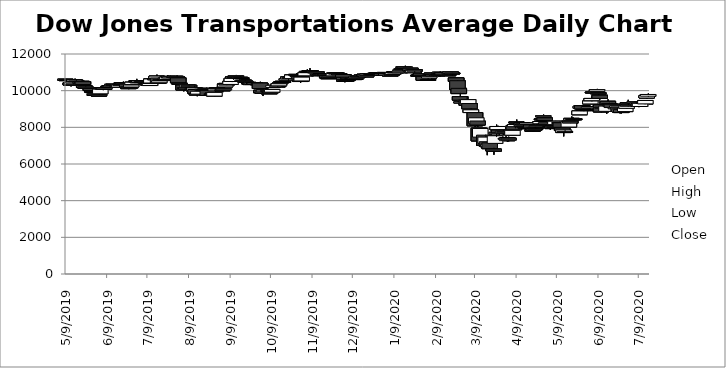
| Category | Open | High | Low | Close |
|---|---|---|---|---|
| 5/9/19 | 10580.43 | 10644.41 | 10483.71 | 10627.37 |
| 5/10/19 | 10601.52 | 10639.49 | 10372.99 | 10602.19 |
| 5/13/19 | 10427.68 | 10433.23 | 10229.95 | 10305.85 |
| 5/14/19 | 10328.77 | 10528.94 | 10328.44 | 10454.97 |
| 5/15/19 | 10405.1 | 10500.78 | 10332.63 | 10475.08 |
| 5/16/19 | 10495.08 | 10657.79 | 10493.3 | 10605.61 |
| 5/17/19 | 10538.49 | 10619.79 | 10469.27 | 10491.85 |
| 5/20/19 | 10427.78 | 10508.19 | 10389.24 | 10461.73 |
| 5/21/19 | 10504.59 | 10563.59 | 10491.45 | 10510.87 |
| 5/22/19 | 10490.14 | 10490.14 | 10307.77 | 10332.98 |
| 5/23/19 | 10278.9 | 10278.9 | 10083.66 | 10171.61 |
| 5/24/19 | 10204.95 | 10242 | 10063.12 | 10137.59 |
| 5/28/19 | 10124.26 | 10164.05 | 10005.24 | 10005.97 |
| 5/29/19 | 9973.82 | 9980.24 | 9880.54 | 9929.95 |
| 5/30/19 | 9944.4 | 10007.8 | 9865.72 | 9926.47 |
| 5/31/19 | 9811.49 | 9819.3 | 9722.26 | 9738.03 |
| 6/3/19 | 9739.37 | 9881.3 | 9715.2 | 9759.86 |
| 6/4/19 | 9828.11 | 10089.3 | 9821.95 | 10083.76 |
| 6/5/19 | 10109.36 | 10190.78 | 10097.05 | 10171.3 |
| 6/6/19 | 10155.27 | 10155.27 | 10013.16 | 10077.54 |
| 6/7/19 | 10103.88 | 10219.19 | 10103.88 | 10140.64 |
| 6/10/19 | 10194.59 | 10358.1 | 10194.59 | 10231.9 |
| 6/11/19 | 10275.18 | 10339.82 | 10150.78 | 10198.55 |
| 6/12/19 | 10198.43 | 10258.33 | 10159.03 | 10246.96 |
| 6/13/19 | 10268.23 | 10365.71 | 10256.13 | 10347.36 |
| 6/14/19 | 10347.91 | 10353.07 | 10218.81 | 10305.3 |
| 6/17/19 | 10297.31 | 10297.31 | 10191.48 | 10199.04 |
| 6/18/19 | 10194.22 | 10386.79 | 10194.22 | 10320.85 |
| 6/19/19 | 10333.89 | 10353.71 | 10269.76 | 10341.63 |
| 6/20/19 | 10431.71 | 10462.59 | 10345.84 | 10412.66 |
| 6/21/19 | 10412.9 | 10492.79 | 10350.93 | 10352.49 |
| 6/24/19 | 10357.48 | 10364.66 | 10189.93 | 10197.39 |
| 6/25/19 | 10193.4 | 10206.77 | 10082.88 | 10109.91 |
| 6/26/19 | 10127.1 | 10209.94 | 10109.39 | 10176.79 |
| 6/27/19 | 10199.1 | 10360.62 | 10195.51 | 10308.53 |
| 6/28/19 | 10332.2 | 10471.85 | 10332.2 | 10461.98 |
| 7/1/19 | 10533.24 | 10643.83 | 10444.65 | 10505.93 |
| 7/2/19 | 10527.15 | 10531.41 | 10386.77 | 10420.46 |
| 7/3/19 | 10443.02 | 10534.46 | 10435.63 | 10523.31 |
| 7/5/19 | 10493.01 | 10510.17 | 10344.74 | 10485.02 |
| 7/8/19 | 10457.4 | 10471.77 | 10378.58 | 10416.13 |
| 7/9/19 | 10385.95 | 10397.2 | 10304.99 | 10339.01 |
| 7/10/19 | 10363.6 | 10432.53 | 10274.14 | 10291.64 |
| 7/11/19 | 10280.37 | 10420.92 | 10260.25 | 10390.04 |
| 7/12/19 | 10417.41 | 10655 | 10416.36 | 10637.31 |
| 7/15/19 | 10635.39 | 10655.44 | 10572.97 | 10601.03 |
| 7/16/19 | 10668.64 | 10876.38 | 10666 | 10794.59 |
| 7/17/19 | 10693.12 | 10693.12 | 10403.09 | 10406.93 |
| 7/18/19 | 10432.01 | 10542.8 | 10432.01 | 10537.51 |
| 7/19/19 | 10554.58 | 10673.67 | 10554.58 | 10604.2 |
| 7/22/19 | 10624.63 | 10691.82 | 10602.88 | 10622.92 |
| 7/23/19 | 10655.66 | 10721.12 | 10636.07 | 10717.6 |
| 7/24/19 | 10611.46 | 10853.3 | 10583.11 | 10775.39 |
| 7/25/19 | 10757.92 | 10780.6 | 10666.22 | 10693.82 |
| 7/26/19 | 10699.67 | 10808.04 | 10668.12 | 10776.67 |
| 7/29/19 | 10756.1 | 10785.91 | 10736.03 | 10776 |
| 7/30/19 | 10739.06 | 10799.72 | 10632.72 | 10784.84 |
| 7/31/19 | 10753.84 | 10819.32 | 10598.57 | 10701.75 |
| 8/1/19 | 10699.13 | 10710.53 | 10399.09 | 10433.45 |
| 8/2/19 | 10410.34 | 10434.16 | 10313.26 | 10374.43 |
| 8/5/19 | 10304.9 | 10304.9 | 9959.84 | 10040.23 |
| 8/6/19 | 10137.53 | 10195.26 | 10038.77 | 10172.52 |
| 8/7/19 | 10110.28 | 10166.36 | 9965.07 | 10150.21 |
| 8/8/19 | 10184.81 | 10339.37 | 10183.45 | 10324.38 |
| 8/9/19 | 10297.68 | 10310.18 | 10161.28 | 10207.21 |
| 8/12/19 | 10165.27 | 10165.27 | 9997.16 | 10032.49 |
| 8/13/19 | 10018.22 | 10271.68 | 9956.45 | 10148.68 |
| 8/14/19 | 10063.58 | 10063.58 | 9820.3 | 9842.4 |
| 8/15/19 | 9858.92 | 9870.57 | 9695.49 | 9764.49 |
| 8/16/19 | 9810.24 | 9988.63 | 9795.39 | 9967.32 |
| 8/19/19 | 10061.02 | 10162.22 | 10061.02 | 10081.38 |
| 8/20/19 | 10054.68 | 10064.89 | 10001.88 | 10006.03 |
| 8/21/19 | 10089.73 | 10145.39 | 10075.46 | 10107.47 |
| 8/22/19 | 10129.48 | 10155.82 | 10019.56 | 10073.15 |
| 8/23/19 | 10020.05 | 10051.43 | 9702.19 | 9739.74 |
| 8/26/19 | 9824.08 | 9864.12 | 9748.97 | 9834.72 |
| 8/27/19 | 9893.73 | 9897.79 | 9717.86 | 9734.68 |
| 8/28/19 | 9703.34 | 9931.43 | 9676.06 | 9907.15 |
| 8/29/19 | 9992.07 | 10151.64 | 9992.07 | 10105.4 |
| 8/30/19 | 10148.9 | 10230.14 | 10101.77 | 10126.98 |
| 9/3/19 | 10050.84 | 10093.94 | 9909.77 | 9991.52 |
| 9/4/19 | 10049.19 | 10122.35 | 10046.48 | 10111.31 |
| 9/5/19 | 10204.16 | 10412.29 | 10204.16 | 10369.92 |
| 9/6/19 | 10395.83 | 10426.37 | 10297.06 | 10302.92 |
| 9/9/19 | 10339.47 | 10516.72 | 10335.61 | 10510.56 |
| 9/10/19 | 10499.65 | 10672.12 | 10465.07 | 10672.12 |
| 9/11/19 | 10687.18 | 10761.37 | 10587.79 | 10761.19 |
| 9/12/19 | 10763.59 | 10763.84 | 10639.97 | 10713.51 |
| 9/13/19 | 10783.62 | 10856.73 | 10772.31 | 10813.62 |
| 9/16/19 | 10699.92 | 10804.36 | 10649.52 | 10730.28 |
| 9/17/19 | 10705.26 | 10730.58 | 10636.82 | 10705.65 |
| 9/18/19 | 10534.95 | 10583.9 | 10447.19 | 10576.34 |
| 9/19/19 | 10571.59 | 10583.93 | 10487.18 | 10504.22 |
| 9/20/19 | 10515.69 | 10566.52 | 10408.08 | 10454.36 |
| 9/23/19 | 10423.51 | 10455.21 | 10358.06 | 10382.66 |
| 9/24/19 | 10429.85 | 10531.88 | 10295.93 | 10333.31 |
| 9/25/19 | 10335.17 | 10477.11 | 10327.04 | 10433.32 |
| 9/26/19 | 10441.8 | 10443.45 | 10367.47 | 10409.03 |
| 9/27/19 | 10442.62 | 10487.76 | 10320.36 | 10341.27 |
| 9/30/19 | 10382.3 | 10416.83 | 10359.14 | 10363.58 |
| 10/1/19 | 10415.77 | 10484.81 | 10082.6 | 10119.6 |
| 10/2/19 | 10026.76 | 10026.76 | 9804.34 | 9884.35 |
| 10/3/19 | 9878.4 | 9929.97 | 9708.09 | 9925.98 |
| 10/4/19 | 9939 | 10033.08 | 9917.83 | 10029.84 |
| 10/7/19 | 10000.91 | 10094.01 | 9948.21 | 10014.56 |
| 10/8/19 | 9896.05 | 9944.4 | 9825.85 | 9829.2 |
| 10/9/19 | 9899.53 | 9980.09 | 9895.5 | 9943.33 |
| 10/10/19 | 9917.51 | 10073.84 | 9900 | 10067.33 |
| 10/11/19 | 10176.7 | 10370.33 | 10175.17 | 10291.98 |
| 10/14/19 | 10247.57 | 10272.38 | 10199.06 | 10256.1 |
| 10/15/19 | 10262.67 | 10426.01 | 10248.6 | 10386.29 |
| 10/16/19 | 10392.9 | 10486.48 | 10383.79 | 10432.81 |
| 10/17/19 | 10474.47 | 10564.79 | 10434.18 | 10496.18 |
| 10/18/19 | 10510.56 | 10541.53 | 10467.87 | 10508.74 |
| 10/21/19 | 10571.99 | 10690.05 | 10571.99 | 10652.12 |
| 10/22/19 | 10640.63 | 10747.9 | 10533.65 | 10747.59 |
| 10/23/19 | 10707.48 | 10737.28 | 10660.26 | 10726.59 |
| 10/24/19 | 10756.59 | 10781.21 | 10626.54 | 10676.57 |
| 10/25/19 | 10658.52 | 10864.25 | 10658.52 | 10856.41 |
| 10/28/19 | 10888.6 | 10959.39 | 10830.16 | 10853.36 |
| 10/29/19 | 10802.09 | 10867.58 | 10771.4 | 10829.77 |
| 10/30/19 | 10762.16 | 10765.03 | 10538.63 | 10639.2 |
| 10/31/19 | 10586.34 | 10596.71 | 10425.79 | 10498.86 |
| 11/1/19 | 10530.99 | 10739.28 | 10522.98 | 10738.81 |
| 11/4/19 | 10810.9 | 10985.76 | 10810.9 | 10982.15 |
| 11/5/19 | 10997.57 | 11161.32 | 10992.96 | 11050.03 |
| 11/6/19 | 11043.33 | 11043.33 | 10952 | 11030.04 |
| 11/7/19 | 11086.73 | 11226.54 | 11074.54 | 11091.37 |
| 11/8/19 | 11072.04 | 11102.51 | 11020.1 | 11067.16 |
| 11/11/19 | 11008.09 | 11046.23 | 10961.21 | 11029.55 |
| 11/12/19 | 11026.56 | 11046.73 | 10939.57 | 10959.26 |
| 11/13/19 | 10908.47 | 10915.71 | 10829.01 | 10842.63 |
| 11/14/19 | 10835.44 | 10879.21 | 10807.44 | 10871.35 |
| 11/15/19 | 10905.85 | 10950.92 | 10866.25 | 10876.29 |
| 11/18/19 | 10840.5 | 10880.72 | 10787.42 | 10879.09 |
| 11/19/19 | 10908.6 | 10919.9 | 10811.95 | 10847.63 |
| 11/20/19 | 10809.96 | 10812.73 | 10674.68 | 10695.04 |
| 11/21/19 | 10705.71 | 10734.33 | 10649.35 | 10681.29 |
| 11/22/19 | 10722.78 | 10789.93 | 10692.57 | 10785.15 |
| 11/25/19 | 10807.09 | 10955.18 | 10796.88 | 10948.5 |
| 11/26/19 | 10945.08 | 11002.39 | 10925.42 | 10970.23 |
| 11/27/19 | 10964.59 | 10991.58 | 10905.49 | 10947.55 |
| 11/29/19 | 10914.57 | 10937.92 | 10841.98 | 10857.57 |
| 12/2/19 | 10879.64 | 10937.14 | 10729.58 | 10734.85 |
| 12/3/19 | 10624.01 | 10624.01 | 10456.27 | 10499.29 |
| 12/4/19 | 10550.8 | 10692.94 | 10550.22 | 10574.58 |
| 12/5/19 | 10603.02 | 10624.59 | 10530.13 | 10574.88 |
| 12/6/19 | 10661.11 | 10762.74 | 10661.11 | 10708.54 |
| 12/9/19 | 10684.43 | 10728.91 | 10658.46 | 10676.51 |
| 12/10/19 | 10659.44 | 10696.52 | 10615.2 | 10629.87 |
| 12/11/19 | 10649.38 | 10687.03 | 10618.28 | 10678.89 |
| 12/12/19 | 10696.2 | 10888.6 | 10657.64 | 10789.41 |
| 12/13/19 | 10788.41 | 10895.03 | 10734.34 | 10775.76 |
| 12/16/19 | 10824.71 | 10923.96 | 10824.71 | 10867.32 |
| 12/17/19 | 10838.79 | 10946.93 | 10836.72 | 10879.27 |
| 12/18/19 | 10897.81 | 10897.81 | 10725.92 | 10779.78 |
| 12/19/19 | 10770.33 | 10843.07 | 10768.39 | 10804.78 |
| 12/20/19 | 10834.04 | 10912.58 | 10791.33 | 10900.73 |
| 12/23/19 | 10925.91 | 10949.68 | 10888.29 | 10912.68 |
| 12/24/19 | 10910.43 | 10923.48 | 10883.95 | 10915.55 |
| 12/26/19 | 10933.84 | 10951.12 | 10888.99 | 10950.6 |
| 12/27/19 | 10970.11 | 10977.59 | 10918.56 | 10936.7 |
| 12/30/19 | 10941.82 | 10941.82 | 10850.21 | 10874.58 |
| 12/31/19 | 10855.19 | 10921.24 | 10846.73 | 10901.28 |
| 1/2/20 | 10967.27 | 10994.49 | 10881.6 | 10994.31 |
| 1/3/20 | 10852.63 | 10917.71 | 10793.64 | 10911.4 |
| 1/6/20 | 10789.13 | 10851.2 | 10745.88 | 10848.73 |
| 1/7/20 | 10841.81 | 10926.22 | 10793.34 | 10887.56 |
| 1/8/20 | 10882.96 | 11051.19 | 10870.71 | 10983.64 |
| 1/9/20 | 11024.93 | 11055.47 | 10991.61 | 11025.82 |
| 1/10/20 | 11033.44 | 11049.66 | 10961.51 | 10973.88 |
| 1/13/20 | 10978.7 | 11065.76 | 10974.43 | 11062.74 |
| 1/14/20 | 11087.45 | 11228.2 | 11086.48 | 11164.51 |
| 1/15/20 | 11190.17 | 11268.1 | 11154.16 | 11195.39 |
| 1/16/20 | 11259.72 | 11326.03 | 11255.23 | 11304.97 |
| 1/17/20 | 11248.09 | 11359.49 | 11190.05 | 11278.85 |
| 1/21/20 | 11226.2 | 11252.77 | 11028.41 | 11075.01 |
| 1/22/20 | 11098.32 | 11134.03 | 10991.67 | 10999.36 |
| 1/23/20 | 10982.36 | 11155.14 | 10872.07 | 11143.42 |
| 1/24/20 | 11142.81 | 11149.04 | 10972.35 | 11059.84 |
| 1/27/20 | 10848.06 | 10889.32 | 10766.84 | 10796.83 |
| 1/28/20 | 10863.14 | 10921.55 | 10814.2 | 10861.34 |
| 1/29/20 | 10863.26 | 11038.15 | 10859.23 | 10905.64 |
| 1/30/20 | 10815.87 | 10844.43 | 10675.5 | 10833.17 |
| 1/31/20 | 10777.57 | 10778.24 | 10533.29 | 10566.74 |
| 2/3/20 | 10611.44 | 10705.42 | 10570.95 | 10590.66 |
| 2/4/20 | 10690.45 | 10818.34 | 10690.45 | 10783.03 |
| 2/5/20 | 10887.37 | 10956.74 | 10856.54 | 10928.84 |
| 2/6/20 | 10961 | 10988.28 | 10864.27 | 10874.4 |
| 2/7/20 | 10823.44 | 10889.93 | 10781.45 | 10857.73 |
| 2/10/20 | 10843.18 | 10874.07 | 10805.96 | 10866.58 |
| 2/11/20 | 10915.14 | 11005.22 | 10894.84 | 10902.72 |
| 2/12/20 | 10958.38 | 11042.04 | 10955.92 | 11003.45 |
| 2/13/20 | 10967.47 | 11014.31 | 10894.95 | 10994.14 |
| 2/14/20 | 10982.18 | 11001.35 | 10841.27 | 10862.92 |
| 2/18/20 | 10846.32 | 10916.74 | 10810.72 | 10865.58 |
| 2/19/20 | 10895.3 | 10967.33 | 10888.52 | 10943.24 |
| 2/20/20 | 10965.03 | 11071.92 | 10937.46 | 11032.96 |
| 2/21/20 | 10969.06 | 10977.44 | 10826.97 | 10908.94 |
| 2/24/20 | 10698.11 | 10698.11 | 10397.4 | 10509.92 |
| 2/25/20 | 10542.93 | 10557.55 | 10039.06 | 10061.46 |
| 2/26/20 | 10126.76 | 10141.68 | 9828.73 | 9840.89 |
| 2/27/20 | 9674.95 | 9884.05 | 9368.58 | 9484.44 |
| 2/28/20 | 9331.55 | 9421.62 | 9127.16 | 9388.19 |
| 3/2/20 | 9437.47 | 9489.69 | 9156.01 | 9475.68 |
| 3/3/20 | 9481.35 | 9695.5 | 9148.97 | 9200.67 |
| 3/4/20 | 9288.65 | 9524.14 | 9189.84 | 9512.05 |
| 3/5/20 | 9297.92 | 9297.92 | 8979.34 | 9010.92 |
| 3/6/20 | 8807.08 | 9054.41 | 8659.62 | 8956.06 |
| 3/9/20 | 8803.05 | 8803.05 | 8015.3 | 8083.49 |
| 3/10/20 | 8194.09 | 8521.39 | 8069.45 | 8520.84 |
| 3/11/20 | 8345.8 | 8345.8 | 8027.81 | 8126.09 |
| 3/12/20 | 7955.81 | 7955.81 | 7253.16 | 7259.02 |
| 3/13/20 | 7466.59 | 7939.4 | 7329.17 | 7939.4 |
| 3/16/20 | 7574.15 | 7574.15 | 6996.32 | 7023.44 |
| 3/17/20 | 7125.27 | 7617.7 | 6905.1 | 7468.23 |
| 3/18/20 | 7215.94 | 7215.94 | 6481.2 | 6971.44 |
| 3/19/20 | 6938.85 | 7324.23 | 6745.76 | 7078.73 |
| 3/20/20 | 7152.64 | 7418.91 | 6799.38 | 6837.72 |
| 3/23/20 | 6816.66 | 6890.23 | 6504.56 | 6703.63 |
| 3/24/20 | 7124.2 | 7567.06 | 7101.41 | 7540.8 |
| 3/25/20 | 7650.23 | 8148.98 | 7468.76 | 7724.87 |
| 3/26/20 | 7872.57 | 8085.58 | 7752.95 | 8045.47 |
| 3/27/20 | 7851.69 | 7891.36 | 7563.67 | 7699.18 |
| 3/30/20 | 7675.83 | 7857.27 | 7561.47 | 7790.91 |
| 3/31/20 | 7758.74 | 7862.56 | 7647.13 | 7732.32 |
| 4/1/20 | 7404.09 | 7512.08 | 7284.82 | 7352.58 |
| 4/2/20 | 7270.52 | 7457.26 | 7209.95 | 7445.71 |
| 4/3/20 | 7413.98 | 7488.4 | 7229 | 7305.31 |
| 4/6/20 | 7569.12 | 7874.99 | 7569.12 | 7837.69 |
| 4/7/20 | 8090.6 | 8220.22 | 7846.24 | 7865.49 |
| 4/8/20 | 8036.24 | 8196.62 | 7942.64 | 8152.39 |
| 4/9/20 | 8290.63 | 8425.45 | 8106.62 | 8236.92 |
| 4/13/20 | 8259.69 | 8259.69 | 7994.69 | 8036.98 |
| 4/14/20 | 8188.28 | 8301.01 | 8118.1 | 8177.69 |
| 4/15/20 | 8058.21 | 8066.83 | 7888.94 | 8003.23 |
| 4/16/20 | 7976.29 | 8003.37 | 7803.37 | 7981.93 |
| 4/17/20 | 8158.56 | 8287.67 | 8114 | 8233.81 |
| 4/20/20 | 8133.11 | 8162.22 | 7894.84 | 7969.73 |
| 4/21/20 | 7820.41 | 7906.82 | 7762.43 | 7844.37 |
| 4/22/20 | 7956.18 | 8007.07 | 7814.49 | 7840.59 |
| 4/23/20 | 7957.06 | 8093.42 | 7917.3 | 7951.66 |
| 4/24/20 | 8032.56 | 8112.8 | 7925.71 | 8092.4 |
| 4/27/20 | 8193.52 | 8381.45 | 8145.63 | 8317.42 |
| 4/28/20 | 8461.39 | 8502.44 | 8321.4 | 8407.32 |
| 4/29/20 | 8580.81 | 8697.49 | 8552.97 | 8628.62 |
| 4/30/20 | 8515.33 | 8515.33 | 8360.91 | 8377.08 |
| 5/1/20 | 8253.25 | 8253.25 | 8081.09 | 8144.86 |
| 5/4/20 | 8040.02 | 8040.02 | 7863.56 | 7980.96 |
| 5/5/20 | 8091.24 | 8188.48 | 8027.44 | 8047.3 |
| 5/6/20 | 8087.95 | 8094.89 | 7920.08 | 7931.83 |
| 5/7/20 | 8012.69 | 8167.64 | 8012.69 | 8050.59 |
| 5/8/20 | 8146.2 | 8347.86 | 8146.2 | 8332.5 |
| 5/11/20 | 8262.7 | 8310.93 | 8165.56 | 8234.18 |
| 5/12/20 | 8249.43 | 8277.07 | 7999.48 | 8000.55 |
| 5/13/20 | 7962.1 | 7967.21 | 7744.56 | 7823.8 |
| 5/14/20 | 7715.17 | 7866.04 | 7505.28 | 7861.34 |
| 5/15/20 | 7778.78 | 7869.53 | 7716.94 | 7761 |
| 5/18/20 | 8015.5 | 8366.34 | 8015.5 | 8322.86 |
| 5/19/20 | 8336.1 | 8424.91 | 8227.8 | 8228.93 |
| 5/20/20 | 8380.96 | 8594.5 | 8380.96 | 8488.98 |
| 5/21/20 | 8469.92 | 8536.93 | 8401.2 | 8452.85 |
| 5/22/20 | 8464.94 | 8496.77 | 8374.91 | 8470.09 |
| 5/26/20 | 8686.39 | 8958.37 | 8686.39 | 8895.61 |
| 5/27/20 | 9042.23 | 9162.59 | 8939.97 | 9151.39 |
| 5/28/20 | 9181.82 | 9187.4 | 8967.29 | 9005.43 |
| 5/29/20 | 8927.74 | 9022.88 | 8875.31 | 8969.79 |
| 6/1/20 | 8962.59 | 9025.72 | 8884.89 | 8965.91 |
| 6/2/20 | 9060.63 | 9169.67 | 9028.83 | 9134.88 |
| 6/3/20 | 9275.32 | 9478.11 | 9270.92 | 9440.77 |
| 6/4/20 | 9451.33 | 9613.53 | 9401.94 | 9575.25 |
| 6/5/20 | 9927.86 | 10075.43 | 9840.4 | 9872.96 |
| 6/8/20 | 9966.04 | 10096.18 | 9944.7 | 10052.85 |
| 6/9/20 | 9882.76 | 9882.76 | 9705.14 | 9825.57 |
| 6/10/20 | 9753.62 | 9761.68 | 9521.06 | 9579.07 |
| 6/11/20 | 9230.64 | 9230.64 | 8820.63 | 8839.36 |
| 6/12/20 | 9097.28 | 9232.28 | 8855.12 | 9081.9 |
| 6/15/20 | 8872.73 | 9211.97 | 8727.93 | 9160.08 |
| 6/16/20 | 9421.51 | 9523.94 | 9158.19 | 9259.63 |
| 6/17/20 | 9295.47 | 9346.18 | 9222.67 | 9239.09 |
| 6/18/20 | 9174.56 | 9281.02 | 9142.36 | 9207.63 |
| 6/19/20 | 9259.37 | 9337.05 | 8985.99 | 9077.75 |
| 6/22/20 | 9014.65 | 9079.01 | 8923.55 | 9061.98 |
| 6/23/20 | 9100.85 | 9229.54 | 9082.39 | 9181.57 |
| 6/24/20 | 9105.46 | 9105.46 | 8877.48 | 8899.24 |
| 6/25/20 | 8837.56 | 9003.87 | 8752.11 | 9000.3 |
| 6/26/20 | 8980.65 | 8992.15 | 8758.41 | 8805.74 |
| 6/29/20 | 8858.68 | 9055.97 | 8815.28 | 9052.64 |
| 6/30/20 | 9036.44 | 9219.59 | 9007.19 | 9172.72 |
| 7/1/20 | 9337.34 | 9501.03 | 9130.58 | 9153.01 |
| 7/2/20 | 9276.44 | 9376.96 | 9220.25 | 9235.7 |
| 7/6/20 | 9338.11 | 9431.36 | 9322.81 | 9386.94 |
| 7/7/20 | 9293.45 | 9375.89 | 9242.24 | 9278.61 |
| 7/8/20 | 9253.9 | 9350.24 | 9228.64 | 9322.43 |
| 7/9/20 | 9300.18 | 9321.96 | 9100.87 | 9140.43 |
| 7/10/20 | 9135.95 | 9340.75 | 9135.95 | 9312.48 |
| 7/13/20 | 9369.35 | 9458.27 | 9258.49 | 9305.95 |
| 7/14/20 | 9277.64 | 9478.94 | 9255.87 | 9465.24 |
| 7/15/20 | 9599.92 | 9778.12 | 9545.57 | 9737.44 |
| 7/16/20 | 9697.28 | 9845.92 | 9655.65 | 9791.39 |